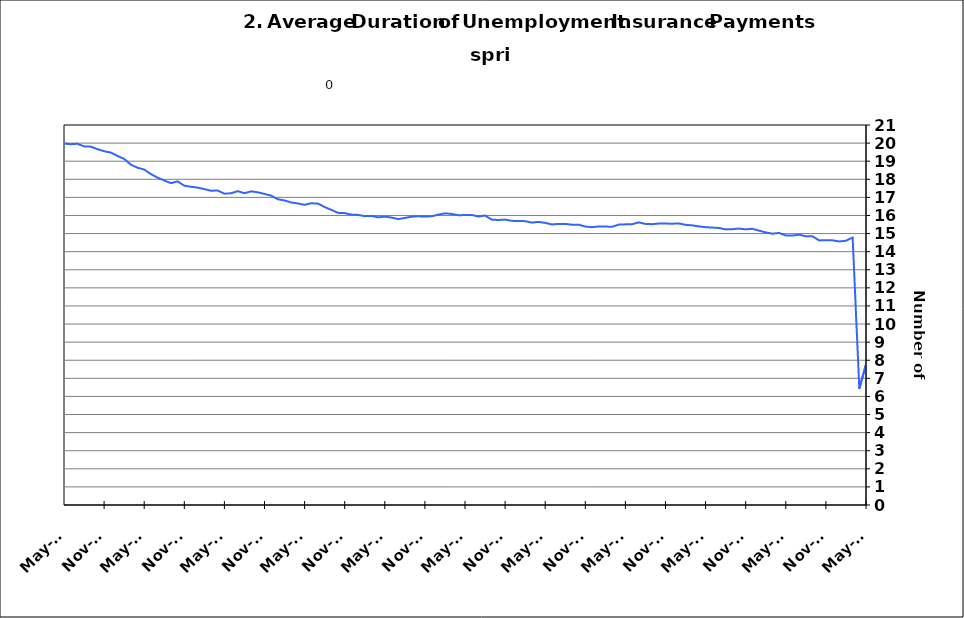
| Category | Average Duration |
|---|---|
| 1995-01-31 | 14.777 |
| 1995-02-28 | 14.761 |
| 1995-03-31 | 14.672 |
| 1995-04-30 | 14.601 |
| 1995-05-31 | 14.598 |
| 1995-06-30 | 14.51 |
| 1995-07-31 | 14.501 |
| 1995-08-31 | 14.41 |
| 1995-09-30 | 14.373 |
| 1995-10-31 | 14.393 |
| 1995-11-30 | 14.306 |
| 1995-12-31 | 14.23 |
| 1996-01-15 | 14.277 |
| 1996-02-15 | 14.204 |
| 1996-03-15 | 14.195 |
| 1996-04-15 | 14.116 |
| 1996-05-15 | 14.187 |
| 1996-06-15 | 14.214 |
| 1996-07-15 | 14.172 |
| 1996-08-15 | 14.174 |
| 1996-09-15 | 14.312 |
| 1996-10-15 | 14.308 |
| 1996-11-15 | 14.344 |
| 1996-12-15 | 14.461 |
| 1997-01-15 | 14.383 |
| 1997-02-15 | 14.413 |
| 1997-03-15 | 14.473 |
| 1997-04-15 | 14.518 |
| 1997-05-31 | 14.455 |
| 1997-06-30 | 14.38 |
| 1997-07-31 | 14.331 |
| 1997-08-31 | 14.279 |
| 1997-09-30 | 14.129 |
| 1997-10-31 | 14.07 |
| 1997-11-30 | 14.067 |
| 1997-12-31 | 13.993 |
| 1998-01-31 | 14.035 |
| 1998-02-28 | 14.047 |
| 1998-03-31 | 13.866 |
| 1998-04-30 | 13.764 |
| 1998-05-31 | 13.76 |
| 1998-06-30 | 13.675 |
| 1998-07-31 | 13.636 |
| 1998-08-31 | 13.558 |
| 1998-09-30 | 13.537 |
| 1998-10-31 | 13.462 |
| 1998-11-30 | 13.294 |
| 1998-12-31 | 13.16 |
| 1999-01-31 | 13.192 |
| 1999-02-28 | 13.297 |
| 1999-03-31 | 13.402 |
| 1999-04-30 | 13.443 |
| 1999-05-31 | 13.587 |
| 1999-06-30 | 13.74 |
| 1999-07-31 | 13.61 |
| 1999-08-31 | 13.717 |
| 1999-09-30 | 13.836 |
| 1999-10-31 | 14.032 |
| 1999-11-30 | 14.175 |
| 1999-12-31 | 14.303 |
| 2000-01-31 | 14.429 |
| 2000-02-29 | 14.376 |
| 2000-03-31 | 14.318 |
| 2000-04-30 | 14.352 |
| 2000-05-31 | 14.265 |
| 2000-06-30 | 14.174 |
| 2000-07-31 | 14.386 |
| 2000-08-31 | 14.362 |
| 2000-09-30 | 14.238 |
| 2000-10-31 | 14.236 |
| 2000-11-30 | 14.118 |
| 2000-12-31 | 14.004 |
| 2001-01-31 | 13.831 |
| 2001-02-28 | 13.708 |
| 2001-03-31 | 13.528 |
| 2001-04-30 | 13.376 |
| 2001-05-31 | 13.219 |
| 2001-06-30 | 13.171 |
| 2001-07-31 | 13.214 |
| 2001-08-31 | 13.157 |
| 2001-09-30 | 13.341 |
| 2001-10-31 | 13.178 |
| 2001-11-30 | 13.143 |
| 2001-12-31 | 13.4 |
| 2002-01-31 | 13.658 |
| 2002-02-28 | 13.952 |
| 2002-03-31 | 14.4 |
| 2002-04-30 | 14.946 |
| 2002-05-31 | 15.299 |
| 2002-06-30 | 15.677 |
| 2002-07-31 | 15.88 |
| 2002-08-31 | 16.087 |
| 2002-09-30 | 16.301 |
| 2002-10-31 | 16.624 |
| 2002-11-30 | 17.004 |
| 2002-12-31 | 17.229 |
| 2003-01-31 | 17.337 |
| 2003-02-28 | 17.359 |
| 2003-03-31 | 17.387 |
| 2003-04-30 | 17.118 |
| 2003-05-31 | 17.133 |
| 2003-06-30 | 17.187 |
| 2003-07-31 | 17.249 |
| 2003-08-31 | 17.486 |
| 2003-09-30 | 17.575 |
| 2003-10-31 | 17.651 |
| 2003-11-30 | 17.867 |
| 2003-12-31 | 17.897 |
| 2004-01-31 | 17.88 |
| 2004-02-29 | 17.995 |
| 2004-03-31 | 17.897 |
| 2004-04-30 | 17.828 |
| 2004-05-31 | 17.883 |
| 2004-06-30 | 17.577 |
| 2004-07-31 | 17.405 |
| 2004-08-31 | 17.207 |
| 2004-09-30 | 16.913 |
| 2004-10-31 | 16.869 |
| 2004-11-30 | 16.518 |
| 2004-12-31 | 16.342 |
| 2005-01-31 | 16.376 |
| 2005-02-28 | 16.223 |
| 2005-03-31 | 16.07 |
| 2005-04-30 | 15.951 |
| 2005-05-31 | 15.826 |
| 2005-06-30 | 15.815 |
| 2005-07-31 | 15.99 |
| 2005-08-31 | 15.796 |
| 2005-09-30 | 15.736 |
| 2005-10-31 | 15.703 |
| 2005-11-30 | 15.697 |
| 2005-12-31 | 15.583 |
| 2006-01-31 | 15.497 |
| 2006-02-28 | 15.415 |
| 2006-03-31 | 15.399 |
| 2006-04-30 | 15.663 |
| 2006-05-31 | 15.487 |
| 2006-06-30 | 15.333 |
| 2006-07-31 | 15.144 |
| 2006-08-31 | 14.91 |
| 2006-09-30 | 14.845 |
| 2006-10-31 | 14.766 |
| 2006-11-30 | 14.588 |
| 2006-12-31 | 14.585 |
| 2007-01-31 | 14.485 |
| 2007-02-28 | 14.412 |
| 2007-03-31 | 14.336 |
| 2007-04-30 | 14.26 |
| 2007-05-31 | 14.261 |
| 2007-06-30 | 14.479 |
| 2007-07-30 | 14.599 |
| 2007-08-31 | 14.843 |
| 2007-09-30 | 14.99 |
| 2007-10-31 | 15.008 |
| 2007-11-15 | 15.072 |
| 2007-12-15 09:36:00 | 15.095 |
| 2008-01-14 19:12:00 | 15.068 |
| 2008-02-14 04:48:00 | 15.026 |
| 2008-03-15 14:24:00 | 15.176 |
| 2008-04-15 | 15.005 |
| 2008-05-15 09:36:00 | 15.047 |
| 2008-06-14 19:12:00 | 15.073 |
| 2008-07-15 04:48:00 | 15.03 |
| 2008-08-14 14:24:00 | 15.17 |
| 2008-09-14 | 15.292 |
| 2008-10-14 09:36:00 | 15.161 |
| 2008-11-13 19:12:00 | 14.99 |
| 2008-12-14 04:48:00 | 14.905 |
| 2009-01-13 14:24:00 | 14.874 |
| 2009-02-13 | 14.935 |
| 2009-03-15 09:36:00 | 15.173 |
| 2009-04-14 19:12:00 | 15.519 |
| 2009-05-15 04:48:00 | 15.914 |
| 2009-06-14 14:24:00 | 16.348 |
| 2009-07-15 | 16.557 |
| 2009-08-14 09:36:00 | 16.984 |
| 2009-09-13 19:12:00 | 17.215 |
| 2009-10-14 04:48:00 | 17.535 |
| 2009-11-13 14:24:00 | 18.106 |
| 2009-12-14 | 18.54 |
| 2010-01-13 09:36:00 | 18.944 |
| 2010-02-12 19:12:00 | 19.336 |
| 2010-03-15 04:48:00 | 19.768 |
| 2010-04-14 14:24:00 | 19.926 |
| 2010-05-15 | 19.977 |
| 2010-06-14 09:36:00 | 19.94 |
| 2010-07-14 19:12:00 | 19.962 |
| 2010-08-14 04:48:00 | 19.819 |
| 2010-09-13 14:24:00 | 19.804 |
| 2010-10-14 | 19.667 |
| 2010-11-13 09:36:00 | 19.551 |
| 2010-12-13 19:12:00 | 19.477 |
| 2011-01-13 04:48:00 | 19.292 |
| 2011-02-12 14:24:00 | 19.125 |
| 2011-03-15 | 18.81 |
| 2011-04-14 09:36:00 | 18.639 |
| 2011-05-14 19:12:00 | 18.54 |
| 2011-06-14 04:48:00 | 18.288 |
| 2011-07-14 14:24:00 | 18.091 |
| 2011-08-14 | 17.932 |
| 2011-09-13 09:36:00 | 17.786 |
| 2011-10-13 19:12:00 | 17.884 |
| 2011-11-13 04:48:00 | 17.646 |
| 2011-12-13 14:24:00 | 17.586 |
| 2012-01-13 | 17.54 |
| 2012-02-12 09:36:00 | 17.456 |
| 2012-03-13 19:12:00 | 17.368 |
| 2012-04-13 04:48:00 | 17.381 |
| 2012-05-13 14:24:00 | 17.203 |
| 2012-06-13 | 17.23 |
| 2012-07-13 09:36:00 | 17.342 |
| 2012-08-12 19:12:00 | 17.231 |
| 2012-09-12 04:48:00 | 17.333 |
| 2012-10-12 14:24:00 | 17.279 |
| 2012-11-12 | 17.187 |
| 2012-12-12 09:36:00 | 17.098 |
| 2013-01-11 19:12:00 | 16.896 |
| 2013-02-11 04:48:00 | 16.83 |
| 2013-03-13 14:24:00 | 16.718 |
| 2013-04-13 | 16.663 |
| 2013-05-13 09:36:00 | 16.59 |
| 2013-06-12 19:12:00 | 16.673 |
| 2013-07-13 04:48:00 | 16.659 |
| 2013-08-12 14:24:00 | 16.466 |
| 2013-09-12 | 16.311 |
| 2013-10-12 09:36:00 | 16.144 |
| 2013-11-11 19:12:00 | 16.13 |
| 2013-12-12 04:48:00 | 16.048 |
| 2014-01-11 14:24:00 | 16.033 |
| 2014-02-11 | 15.962 |
| 2014-03-13 09:36:00 | 15.979 |
| 2014-04-12 19:12:00 | 15.897 |
| 2014-05-13 04:48:00 | 15.936 |
| 2014-06-12 14:24:00 | 15.888 |
| 2014-07-13 | 15.797 |
| 2014-08-12 09:36:00 | 15.865 |
| 2014-09-11 19:12:00 | 15.93 |
| 2014-10-12 04:48:00 | 15.956 |
| 2014-11-11 14:24:00 | 15.939 |
| 2014-12-12 | 15.955 |
| 2015-01-11 09:36:00 | 16.046 |
| 2015-02-10 19:12:00 | 16.117 |
| 2015-03-13 04:48:00 | 16.086 |
| 2015-04-12 14:24:00 | 16.014 |
| 2015-05-13 | 16.023 |
| 2015-06-12 09:36:00 | 16.033 |
| 2015-07-12 19:12:00 | 15.941 |
| 2015-08-12 04:48:00 | 15.997 |
| 2015-09-11 14:24:00 | 15.772 |
| 2015-10-12 | 15.749 |
| 2015-11-11 09:36:00 | 15.773 |
| 2015-12-11 19:12:00 | 15.704 |
| 2016-01-11 04:48:00 | 15.692 |
| 2016-02-10 14:24:00 | 15.687 |
| 2016-03-12 | 15.604 |
| 2016-04-11 09:36:00 | 15.646 |
| 2016-05-11 19:12:00 | 15.592 |
| 2016-06-11 04:48:00 | 15.504 |
| 2016-07-11 14:24:00 | 15.535 |
| 2016-08-11 | 15.535 |
| 2016-09-10 09:36:00 | 15.49 |
| 2016-10-10 19:12:00 | 15.491 |
| 2016-11-10 04:48:00 | 15.386 |
| 2016-12-10 14:24:00 | 15.355 |
| 2017-01-10 | 15.392 |
| 2017-02-09 09:36:00 | 15.391 |
| 2017-03-11 19:12:00 | 15.372 |
| 2017-04-11 04:48:00 | 15.495 |
| 2017-05-11 14:24:00 | 15.509 |
| 2017-06-11 | 15.518 |
| 2017-07-11 09:36:00 | 15.616 |
| 2017-08-10 19:12:00 | 15.534 |
| 2017-09-10 04:48:00 | 15.52 |
| 2017-10-10 14:24:00 | 15.554 |
| 2017-11-10 | 15.552 |
| 2017-12-10 09:36:00 | 15.547 |
| 2018-01-09 19:12:00 | 15.558 |
| 2018-02-09 04:48:00 | 15.483 |
| 2018-03-11 14:24:00 | 15.454 |
| 2018-04-11 | 15.393 |
| 2018-05-11 09:36:00 | 15.352 |
| 2018-06-10 19:12:00 | 15.333 |
| 2018-07-11 04:48:00 | 15.308 |
| 2018-08-10 14:24:00 | 15.231 |
| 2018-09-10 | 15.241 |
| 2018-10-10 09:36:00 | 15.277 |
| 2018-11-09 19:12:00 | 15.234 |
| 2018-12-10 04:48:00 | 15.264 |
| 2019-01-09 14:24:00 | 15.161 |
| 2019-02-09 | 15.064 |
| 2019-03-11 09:36:00 | 14.995 |
| 2019-04-10 19:12:00 | 15.036 |
| 2019-05-11 04:48:00 | 14.892 |
| 2019-06-10 14:24:00 | 14.889 |
| 2019-07-11 | 14.937 |
| 2019-08-10 09:36:00 | 14.848 |
| 2019-09-09 19:12:00 | 14.848 |
| 2019-10-10 04:48:00 | 14.621 |
| 2019-11-09 14:24:00 | 14.633 |
| 2019-12-10 | 14.625 |
| 2020-01-09 09:36:00 | 14.564 |
| 2020-02-08 19:12:00 | 14.605 |
| 2020-03-10 04:48:00 | 14.78 |
| 2020-04-09 14:24:00 | 6.425 |
| 2020-05-10 | 7.771 |